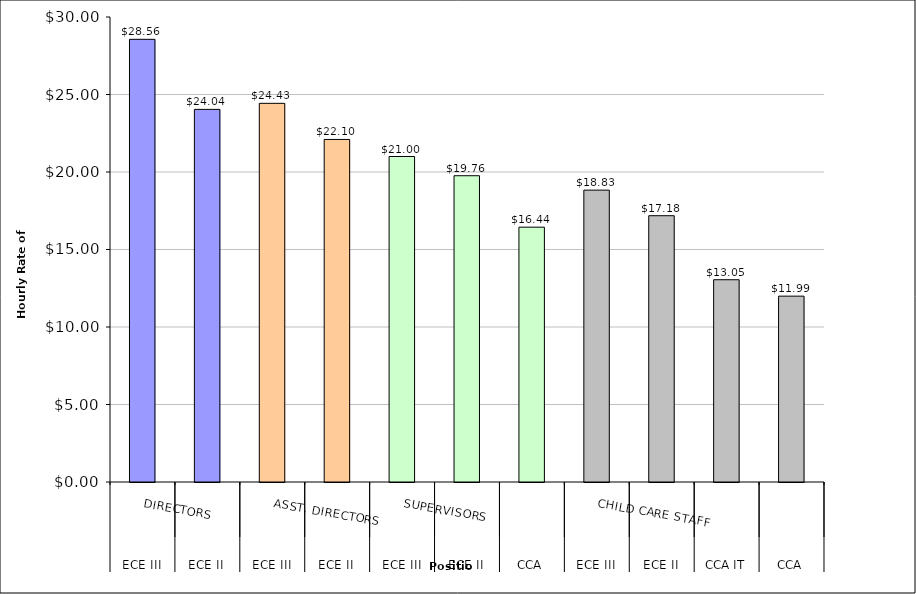
| Category | Series 0 |
|---|---|
| 0 | 28.56 |
| 1 | 24.04 |
| 2 | 24.43 |
| 3 | 22.1 |
| 4 | 21 |
| 5 | 19.76 |
| 6 | 16.44 |
| 7 | 18.83 |
| 8 | 17.18 |
| 9 | 13.05 |
| 10 | 11.99 |